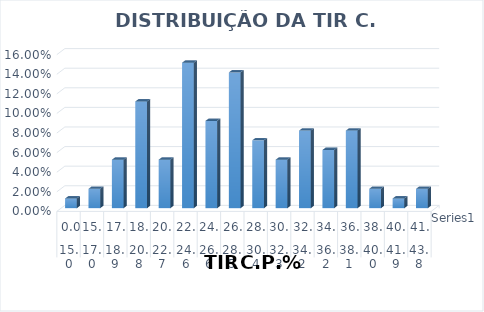
| Category | Series 0 |
|---|---|
| 0 | 0.01 |
| 1 | 0.02 |
| 2 | 0.05 |
| 3 | 0.109 |
| 4 | 0.05 |
| 5 | 0.149 |
| 6 | 0.089 |
| 7 | 0.139 |
| 8 | 0.069 |
| 9 | 0.05 |
| 10 | 0.079 |
| 11 | 0.059 |
| 12 | 0.079 |
| 13 | 0.02 |
| 14 | 0.01 |
| 15 | 0.02 |